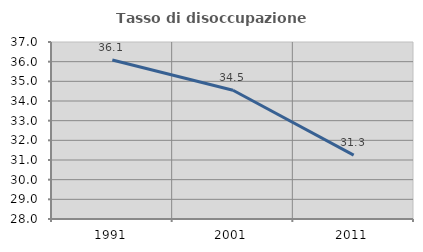
| Category | Tasso di disoccupazione giovanile  |
|---|---|
| 1991.0 | 36.082 |
| 2001.0 | 34.545 |
| 2011.0 | 31.25 |